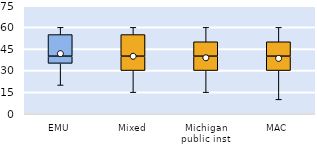
| Category | 25th | 50th | 75th |
|---|---|---|---|
| EMU | 35 | 5 | 15 |
| Mixed | 30 | 10 | 15 |
| Michigan public inst | 30 | 10 | 10 |
| MAC | 30 | 10 | 10 |